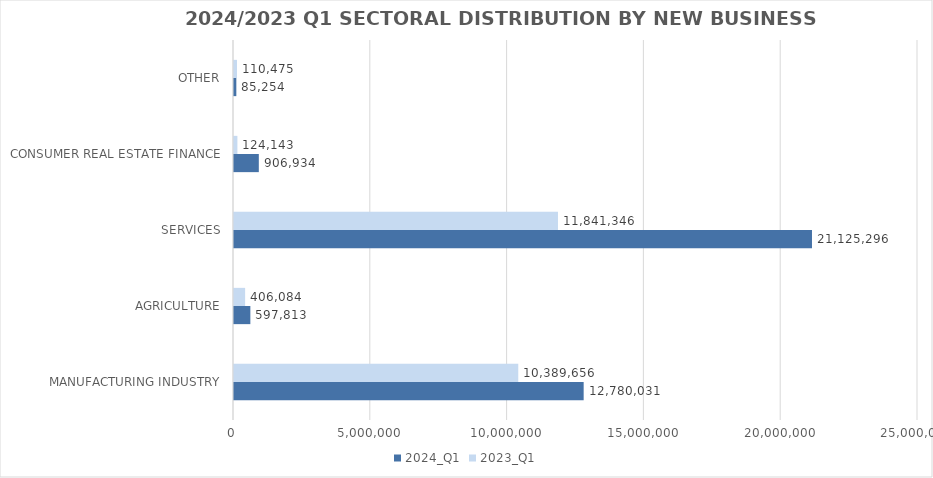
| Category | 2024_Q1 | 2023_Q1 |
|---|---|---|
| MANUFACTURING INDUSTRY | 12780030.739 | 10389655.7 |
| AGRICULTURE | 597812.929 | 406084.149 |
| SERVICES | 21125296.029 | 11841346.272 |
| CONSUMER REAL ESTATE FINANCE | 906934 | 124143 |
| OTHER | 85254 | 110475 |